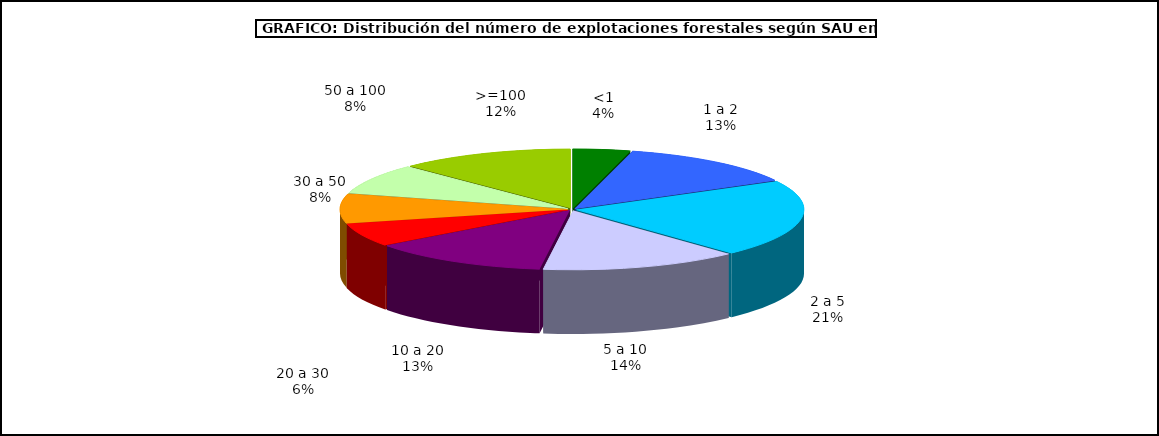
| Category | Series 0 |
|---|---|
| 0 | 7090 |
| 1 | 22629 |
| 2 | 36531 |
| 3 | 24471 |
| 4 | 22161 |
| 5 | 11071 |
| 6 | 13950 |
| 7 | 14531 |
| 8 | 21656 |